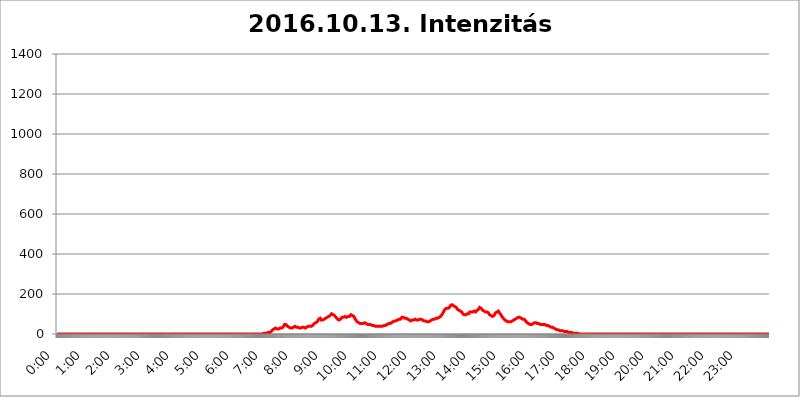
| Category | 2016.10.13. Intenzitás [W/m^2] |
|---|---|
| 0.0 | 0 |
| 0.0006944444444444445 | 0 |
| 0.001388888888888889 | 0 |
| 0.0020833333333333333 | 0 |
| 0.002777777777777778 | 0 |
| 0.003472222222222222 | 0 |
| 0.004166666666666667 | 0 |
| 0.004861111111111111 | 0 |
| 0.005555555555555556 | 0 |
| 0.0062499999999999995 | 0 |
| 0.006944444444444444 | 0 |
| 0.007638888888888889 | 0 |
| 0.008333333333333333 | 0 |
| 0.009027777777777779 | 0 |
| 0.009722222222222222 | 0 |
| 0.010416666666666666 | 0 |
| 0.011111111111111112 | 0 |
| 0.011805555555555555 | 0 |
| 0.012499999999999999 | 0 |
| 0.013194444444444444 | 0 |
| 0.013888888888888888 | 0 |
| 0.014583333333333332 | 0 |
| 0.015277777777777777 | 0 |
| 0.015972222222222224 | 0 |
| 0.016666666666666666 | 0 |
| 0.017361111111111112 | 0 |
| 0.018055555555555557 | 0 |
| 0.01875 | 0 |
| 0.019444444444444445 | 0 |
| 0.02013888888888889 | 0 |
| 0.020833333333333332 | 0 |
| 0.02152777777777778 | 0 |
| 0.022222222222222223 | 0 |
| 0.02291666666666667 | 0 |
| 0.02361111111111111 | 0 |
| 0.024305555555555556 | 0 |
| 0.024999999999999998 | 0 |
| 0.025694444444444447 | 0 |
| 0.02638888888888889 | 0 |
| 0.027083333333333334 | 0 |
| 0.027777777777777776 | 0 |
| 0.02847222222222222 | 0 |
| 0.029166666666666664 | 0 |
| 0.029861111111111113 | 0 |
| 0.030555555555555555 | 0 |
| 0.03125 | 0 |
| 0.03194444444444445 | 0 |
| 0.03263888888888889 | 0 |
| 0.03333333333333333 | 0 |
| 0.034027777777777775 | 0 |
| 0.034722222222222224 | 0 |
| 0.035416666666666666 | 0 |
| 0.036111111111111115 | 0 |
| 0.03680555555555556 | 0 |
| 0.0375 | 0 |
| 0.03819444444444444 | 0 |
| 0.03888888888888889 | 0 |
| 0.03958333333333333 | 0 |
| 0.04027777777777778 | 0 |
| 0.04097222222222222 | 0 |
| 0.041666666666666664 | 0 |
| 0.042361111111111106 | 0 |
| 0.04305555555555556 | 0 |
| 0.043750000000000004 | 0 |
| 0.044444444444444446 | 0 |
| 0.04513888888888889 | 0 |
| 0.04583333333333334 | 0 |
| 0.04652777777777778 | 0 |
| 0.04722222222222222 | 0 |
| 0.04791666666666666 | 0 |
| 0.04861111111111111 | 0 |
| 0.049305555555555554 | 0 |
| 0.049999999999999996 | 0 |
| 0.05069444444444445 | 0 |
| 0.051388888888888894 | 0 |
| 0.052083333333333336 | 0 |
| 0.05277777777777778 | 0 |
| 0.05347222222222222 | 0 |
| 0.05416666666666667 | 0 |
| 0.05486111111111111 | 0 |
| 0.05555555555555555 | 0 |
| 0.05625 | 0 |
| 0.05694444444444444 | 0 |
| 0.057638888888888885 | 0 |
| 0.05833333333333333 | 0 |
| 0.05902777777777778 | 0 |
| 0.059722222222222225 | 0 |
| 0.06041666666666667 | 0 |
| 0.061111111111111116 | 0 |
| 0.06180555555555556 | 0 |
| 0.0625 | 0 |
| 0.06319444444444444 | 0 |
| 0.06388888888888888 | 0 |
| 0.06458333333333334 | 0 |
| 0.06527777777777778 | 0 |
| 0.06597222222222222 | 0 |
| 0.06666666666666667 | 0 |
| 0.06736111111111111 | 0 |
| 0.06805555555555555 | 0 |
| 0.06874999999999999 | 0 |
| 0.06944444444444443 | 0 |
| 0.07013888888888889 | 0 |
| 0.07083333333333333 | 0 |
| 0.07152777777777779 | 0 |
| 0.07222222222222223 | 0 |
| 0.07291666666666667 | 0 |
| 0.07361111111111111 | 0 |
| 0.07430555555555556 | 0 |
| 0.075 | 0 |
| 0.07569444444444444 | 0 |
| 0.0763888888888889 | 0 |
| 0.07708333333333334 | 0 |
| 0.07777777777777778 | 0 |
| 0.07847222222222222 | 0 |
| 0.07916666666666666 | 0 |
| 0.0798611111111111 | 0 |
| 0.08055555555555556 | 0 |
| 0.08125 | 0 |
| 0.08194444444444444 | 0 |
| 0.08263888888888889 | 0 |
| 0.08333333333333333 | 0 |
| 0.08402777777777777 | 0 |
| 0.08472222222222221 | 0 |
| 0.08541666666666665 | 0 |
| 0.08611111111111112 | 0 |
| 0.08680555555555557 | 0 |
| 0.08750000000000001 | 0 |
| 0.08819444444444445 | 0 |
| 0.08888888888888889 | 0 |
| 0.08958333333333333 | 0 |
| 0.09027777777777778 | 0 |
| 0.09097222222222222 | 0 |
| 0.09166666666666667 | 0 |
| 0.09236111111111112 | 0 |
| 0.09305555555555556 | 0 |
| 0.09375 | 0 |
| 0.09444444444444444 | 0 |
| 0.09513888888888888 | 0 |
| 0.09583333333333333 | 0 |
| 0.09652777777777777 | 0 |
| 0.09722222222222222 | 0 |
| 0.09791666666666667 | 0 |
| 0.09861111111111111 | 0 |
| 0.09930555555555555 | 0 |
| 0.09999999999999999 | 0 |
| 0.10069444444444443 | 0 |
| 0.1013888888888889 | 0 |
| 0.10208333333333335 | 0 |
| 0.10277777777777779 | 0 |
| 0.10347222222222223 | 0 |
| 0.10416666666666667 | 0 |
| 0.10486111111111111 | 0 |
| 0.10555555555555556 | 0 |
| 0.10625 | 0 |
| 0.10694444444444444 | 0 |
| 0.1076388888888889 | 0 |
| 0.10833333333333334 | 0 |
| 0.10902777777777778 | 0 |
| 0.10972222222222222 | 0 |
| 0.1111111111111111 | 0 |
| 0.11180555555555556 | 0 |
| 0.11180555555555556 | 0 |
| 0.1125 | 0 |
| 0.11319444444444444 | 0 |
| 0.11388888888888889 | 0 |
| 0.11458333333333333 | 0 |
| 0.11527777777777777 | 0 |
| 0.11597222222222221 | 0 |
| 0.11666666666666665 | 0 |
| 0.1173611111111111 | 0 |
| 0.11805555555555557 | 0 |
| 0.11944444444444445 | 0 |
| 0.12013888888888889 | 0 |
| 0.12083333333333333 | 0 |
| 0.12152777777777778 | 0 |
| 0.12222222222222223 | 0 |
| 0.12291666666666667 | 0 |
| 0.12291666666666667 | 0 |
| 0.12361111111111112 | 0 |
| 0.12430555555555556 | 0 |
| 0.125 | 0 |
| 0.12569444444444444 | 0 |
| 0.12638888888888888 | 0 |
| 0.12708333333333333 | 0 |
| 0.16875 | 0 |
| 0.12847222222222224 | 0 |
| 0.12916666666666668 | 0 |
| 0.12986111111111112 | 0 |
| 0.13055555555555556 | 0 |
| 0.13125 | 0 |
| 0.13194444444444445 | 0 |
| 0.1326388888888889 | 0 |
| 0.13333333333333333 | 0 |
| 0.13402777777777777 | 0 |
| 0.13402777777777777 | 0 |
| 0.13472222222222222 | 0 |
| 0.13541666666666666 | 0 |
| 0.1361111111111111 | 0 |
| 0.13749999999999998 | 0 |
| 0.13819444444444443 | 0 |
| 0.1388888888888889 | 0 |
| 0.13958333333333334 | 0 |
| 0.14027777777777778 | 0 |
| 0.14097222222222222 | 0 |
| 0.14166666666666666 | 0 |
| 0.1423611111111111 | 0 |
| 0.14305555555555557 | 0 |
| 0.14375000000000002 | 0 |
| 0.14444444444444446 | 0 |
| 0.1451388888888889 | 0 |
| 0.1451388888888889 | 0 |
| 0.14652777777777778 | 0 |
| 0.14722222222222223 | 0 |
| 0.14791666666666667 | 0 |
| 0.1486111111111111 | 0 |
| 0.14930555555555555 | 0 |
| 0.15 | 0 |
| 0.15069444444444444 | 0 |
| 0.15138888888888888 | 0 |
| 0.15208333333333332 | 0 |
| 0.15277777777777776 | 0 |
| 0.15347222222222223 | 0 |
| 0.15416666666666667 | 0 |
| 0.15486111111111112 | 0 |
| 0.15555555555555556 | 0 |
| 0.15625 | 0 |
| 0.15694444444444444 | 0 |
| 0.15763888888888888 | 0 |
| 0.15833333333333333 | 0 |
| 0.15902777777777777 | 0 |
| 0.15972222222222224 | 0 |
| 0.16041666666666668 | 0 |
| 0.16111111111111112 | 0 |
| 0.16180555555555556 | 0 |
| 0.1625 | 0 |
| 0.16319444444444445 | 0 |
| 0.1638888888888889 | 0 |
| 0.16458333333333333 | 0 |
| 0.16527777777777777 | 0 |
| 0.16597222222222222 | 0 |
| 0.16666666666666666 | 0 |
| 0.1673611111111111 | 0 |
| 0.16805555555555554 | 0 |
| 0.16874999999999998 | 0 |
| 0.16944444444444443 | 0 |
| 0.17013888888888887 | 0 |
| 0.1708333333333333 | 0 |
| 0.17152777777777775 | 0 |
| 0.17222222222222225 | 0 |
| 0.1729166666666667 | 0 |
| 0.17361111111111113 | 0 |
| 0.17430555555555557 | 0 |
| 0.17500000000000002 | 0 |
| 0.17569444444444446 | 0 |
| 0.1763888888888889 | 0 |
| 0.17708333333333334 | 0 |
| 0.17777777777777778 | 0 |
| 0.17847222222222223 | 0 |
| 0.17916666666666667 | 0 |
| 0.1798611111111111 | 0 |
| 0.18055555555555555 | 0 |
| 0.18125 | 0 |
| 0.18194444444444444 | 0 |
| 0.1826388888888889 | 0 |
| 0.18333333333333335 | 0 |
| 0.1840277777777778 | 0 |
| 0.18472222222222223 | 0 |
| 0.18541666666666667 | 0 |
| 0.18611111111111112 | 0 |
| 0.18680555555555556 | 0 |
| 0.1875 | 0 |
| 0.18819444444444444 | 0 |
| 0.18888888888888888 | 0 |
| 0.18958333333333333 | 0 |
| 0.19027777777777777 | 0 |
| 0.1909722222222222 | 0 |
| 0.19166666666666665 | 0 |
| 0.19236111111111112 | 0 |
| 0.19305555555555554 | 0 |
| 0.19375 | 0 |
| 0.19444444444444445 | 0 |
| 0.1951388888888889 | 0 |
| 0.19583333333333333 | 0 |
| 0.19652777777777777 | 0 |
| 0.19722222222222222 | 0 |
| 0.19791666666666666 | 0 |
| 0.1986111111111111 | 0 |
| 0.19930555555555554 | 0 |
| 0.19999999999999998 | 0 |
| 0.20069444444444443 | 0 |
| 0.20138888888888887 | 0 |
| 0.2020833333333333 | 0 |
| 0.2027777777777778 | 0 |
| 0.2034722222222222 | 0 |
| 0.2041666666666667 | 0 |
| 0.20486111111111113 | 0 |
| 0.20555555555555557 | 0 |
| 0.20625000000000002 | 0 |
| 0.20694444444444446 | 0 |
| 0.2076388888888889 | 0 |
| 0.20833333333333334 | 0 |
| 0.20902777777777778 | 0 |
| 0.20972222222222223 | 0 |
| 0.21041666666666667 | 0 |
| 0.2111111111111111 | 0 |
| 0.21180555555555555 | 0 |
| 0.2125 | 0 |
| 0.21319444444444444 | 0 |
| 0.2138888888888889 | 0 |
| 0.21458333333333335 | 0 |
| 0.2152777777777778 | 0 |
| 0.21597222222222223 | 0 |
| 0.21666666666666667 | 0 |
| 0.21736111111111112 | 0 |
| 0.21805555555555556 | 0 |
| 0.21875 | 0 |
| 0.21944444444444444 | 0 |
| 0.22013888888888888 | 0 |
| 0.22083333333333333 | 0 |
| 0.22152777777777777 | 0 |
| 0.2222222222222222 | 0 |
| 0.22291666666666665 | 0 |
| 0.2236111111111111 | 0 |
| 0.22430555555555556 | 0 |
| 0.225 | 0 |
| 0.22569444444444445 | 0 |
| 0.2263888888888889 | 0 |
| 0.22708333333333333 | 0 |
| 0.22777777777777777 | 0 |
| 0.22847222222222222 | 0 |
| 0.22916666666666666 | 0 |
| 0.2298611111111111 | 0 |
| 0.23055555555555554 | 0 |
| 0.23124999999999998 | 0 |
| 0.23194444444444443 | 0 |
| 0.23263888888888887 | 0 |
| 0.2333333333333333 | 0 |
| 0.2340277777777778 | 0 |
| 0.2347222222222222 | 0 |
| 0.2354166666666667 | 0 |
| 0.23611111111111113 | 0 |
| 0.23680555555555557 | 0 |
| 0.23750000000000002 | 0 |
| 0.23819444444444446 | 0 |
| 0.2388888888888889 | 0 |
| 0.23958333333333334 | 0 |
| 0.24027777777777778 | 0 |
| 0.24097222222222223 | 0 |
| 0.24166666666666667 | 0 |
| 0.2423611111111111 | 0 |
| 0.24305555555555555 | 0 |
| 0.24375 | 0 |
| 0.24444444444444446 | 0 |
| 0.24513888888888888 | 0 |
| 0.24583333333333335 | 0 |
| 0.2465277777777778 | 0 |
| 0.24722222222222223 | 0 |
| 0.24791666666666667 | 0 |
| 0.24861111111111112 | 0 |
| 0.24930555555555556 | 0 |
| 0.25 | 0 |
| 0.25069444444444444 | 0 |
| 0.2513888888888889 | 0 |
| 0.2520833333333333 | 0 |
| 0.25277777777777777 | 0 |
| 0.2534722222222222 | 0 |
| 0.25416666666666665 | 0 |
| 0.2548611111111111 | 0 |
| 0.2555555555555556 | 0 |
| 0.25625000000000003 | 0 |
| 0.2569444444444445 | 0 |
| 0.2576388888888889 | 0 |
| 0.25833333333333336 | 0 |
| 0.2590277777777778 | 0 |
| 0.25972222222222224 | 0 |
| 0.2604166666666667 | 0 |
| 0.2611111111111111 | 0 |
| 0.26180555555555557 | 0 |
| 0.2625 | 0 |
| 0.26319444444444445 | 0 |
| 0.2638888888888889 | 0 |
| 0.26458333333333334 | 0 |
| 0.2652777777777778 | 0 |
| 0.2659722222222222 | 0 |
| 0.26666666666666666 | 0 |
| 0.2673611111111111 | 0 |
| 0.26805555555555555 | 0 |
| 0.26875 | 0 |
| 0.26944444444444443 | 0 |
| 0.2701388888888889 | 0 |
| 0.2708333333333333 | 0 |
| 0.27152777777777776 | 0 |
| 0.2722222222222222 | 0 |
| 0.27291666666666664 | 0 |
| 0.2736111111111111 | 0 |
| 0.2743055555555555 | 0 |
| 0.27499999999999997 | 0 |
| 0.27569444444444446 | 0 |
| 0.27638888888888885 | 0 |
| 0.27708333333333335 | 0 |
| 0.2777777777777778 | 0 |
| 0.27847222222222223 | 0 |
| 0.2791666666666667 | 0 |
| 0.2798611111111111 | 0 |
| 0.28055555555555556 | 0 |
| 0.28125 | 0 |
| 0.28194444444444444 | 0 |
| 0.2826388888888889 | 0 |
| 0.2833333333333333 | 0 |
| 0.28402777777777777 | 0 |
| 0.2847222222222222 | 0 |
| 0.28541666666666665 | 0 |
| 0.28611111111111115 | 0 |
| 0.28680555555555554 | 0 |
| 0.28750000000000003 | 0 |
| 0.2881944444444445 | 3.525 |
| 0.2888888888888889 | 3.525 |
| 0.28958333333333336 | 3.525 |
| 0.2902777777777778 | 3.525 |
| 0.29097222222222224 | 3.525 |
| 0.2916666666666667 | 3.525 |
| 0.2923611111111111 | 3.525 |
| 0.29305555555555557 | 3.525 |
| 0.29375 | 3.525 |
| 0.29444444444444445 | 7.887 |
| 0.2951388888888889 | 7.887 |
| 0.29583333333333334 | 7.887 |
| 0.2965277777777778 | 7.887 |
| 0.2972222222222222 | 7.887 |
| 0.29791666666666666 | 7.887 |
| 0.2986111111111111 | 12.257 |
| 0.29930555555555555 | 12.257 |
| 0.3 | 12.257 |
| 0.30069444444444443 | 12.257 |
| 0.3013888888888889 | 16.636 |
| 0.3020833333333333 | 21.024 |
| 0.30277777777777776 | 21.024 |
| 0.3034722222222222 | 25.419 |
| 0.30416666666666664 | 25.419 |
| 0.3048611111111111 | 25.419 |
| 0.3055555555555555 | 29.823 |
| 0.30624999999999997 | 29.823 |
| 0.3069444444444444 | 29.823 |
| 0.3076388888888889 | 29.823 |
| 0.30833333333333335 | 25.419 |
| 0.3090277777777778 | 25.419 |
| 0.30972222222222223 | 25.419 |
| 0.3104166666666667 | 25.419 |
| 0.3111111111111111 | 29.823 |
| 0.31180555555555556 | 29.823 |
| 0.3125 | 29.823 |
| 0.31319444444444444 | 29.823 |
| 0.3138888888888889 | 29.823 |
| 0.3145833333333333 | 29.823 |
| 0.31527777777777777 | 29.823 |
| 0.3159722222222222 | 29.823 |
| 0.31666666666666665 | 34.234 |
| 0.31736111111111115 | 34.234 |
| 0.31805555555555554 | 38.653 |
| 0.31875000000000003 | 47.511 |
| 0.3194444444444445 | 51.951 |
| 0.3201388888888889 | 51.951 |
| 0.32083333333333336 | 47.511 |
| 0.3215277777777778 | 43.079 |
| 0.32222222222222224 | 43.079 |
| 0.3229166666666667 | 38.653 |
| 0.3236111111111111 | 38.653 |
| 0.32430555555555557 | 34.234 |
| 0.325 | 34.234 |
| 0.32569444444444445 | 34.234 |
| 0.3263888888888889 | 34.234 |
| 0.32708333333333334 | 29.823 |
| 0.3277777777777778 | 29.823 |
| 0.3284722222222222 | 29.823 |
| 0.32916666666666666 | 29.823 |
| 0.3298611111111111 | 29.823 |
| 0.33055555555555555 | 29.823 |
| 0.33125 | 34.234 |
| 0.33194444444444443 | 34.234 |
| 0.3326388888888889 | 38.653 |
| 0.3333333333333333 | 38.653 |
| 0.3340277777777778 | 34.234 |
| 0.3347222222222222 | 34.234 |
| 0.3354166666666667 | 34.234 |
| 0.3361111111111111 | 34.234 |
| 0.3368055555555556 | 34.234 |
| 0.33749999999999997 | 34.234 |
| 0.33819444444444446 | 34.234 |
| 0.33888888888888885 | 29.823 |
| 0.33958333333333335 | 29.823 |
| 0.34027777777777773 | 29.823 |
| 0.34097222222222223 | 29.823 |
| 0.3416666666666666 | 29.823 |
| 0.3423611111111111 | 34.234 |
| 0.3430555555555555 | 34.234 |
| 0.34375 | 34.234 |
| 0.3444444444444445 | 34.234 |
| 0.3451388888888889 | 34.234 |
| 0.3458333333333334 | 34.234 |
| 0.34652777777777777 | 34.234 |
| 0.34722222222222227 | 29.823 |
| 0.34791666666666665 | 29.823 |
| 0.34861111111111115 | 29.823 |
| 0.34930555555555554 | 29.823 |
| 0.35000000000000003 | 34.234 |
| 0.3506944444444444 | 34.234 |
| 0.3513888888888889 | 34.234 |
| 0.3520833333333333 | 38.653 |
| 0.3527777777777778 | 38.653 |
| 0.3534722222222222 | 34.234 |
| 0.3541666666666667 | 38.653 |
| 0.3548611111111111 | 38.653 |
| 0.35555555555555557 | 34.234 |
| 0.35625 | 38.653 |
| 0.35694444444444445 | 38.653 |
| 0.3576388888888889 | 38.653 |
| 0.35833333333333334 | 43.079 |
| 0.3590277777777778 | 47.511 |
| 0.3597222222222222 | 47.511 |
| 0.36041666666666666 | 51.951 |
| 0.3611111111111111 | 51.951 |
| 0.36180555555555555 | 51.951 |
| 0.3625 | 56.398 |
| 0.36319444444444443 | 56.398 |
| 0.3638888888888889 | 60.85 |
| 0.3645833333333333 | 60.85 |
| 0.3652777777777778 | 65.31 |
| 0.3659722222222222 | 65.31 |
| 0.3666666666666667 | 74.246 |
| 0.3673611111111111 | 78.722 |
| 0.3680555555555556 | 78.722 |
| 0.36874999999999997 | 78.722 |
| 0.36944444444444446 | 74.246 |
| 0.37013888888888885 | 69.775 |
| 0.37083333333333335 | 69.775 |
| 0.37152777777777773 | 69.775 |
| 0.37222222222222223 | 69.775 |
| 0.3729166666666666 | 69.775 |
| 0.3736111111111111 | 74.246 |
| 0.3743055555555555 | 74.246 |
| 0.375 | 78.722 |
| 0.3756944444444445 | 78.722 |
| 0.3763888888888889 | 78.722 |
| 0.3770833333333334 | 78.722 |
| 0.37777777777777777 | 78.722 |
| 0.37847222222222227 | 83.205 |
| 0.37916666666666665 | 83.205 |
| 0.37986111111111115 | 83.205 |
| 0.38055555555555554 | 87.692 |
| 0.38125000000000003 | 92.184 |
| 0.3819444444444444 | 92.184 |
| 0.3826388888888889 | 92.184 |
| 0.3833333333333333 | 92.184 |
| 0.3840277777777778 | 96.682 |
| 0.3847222222222222 | 101.184 |
| 0.3854166666666667 | 105.69 |
| 0.3861111111111111 | 101.184 |
| 0.38680555555555557 | 96.682 |
| 0.3875 | 92.184 |
| 0.38819444444444445 | 92.184 |
| 0.3888888888888889 | 92.184 |
| 0.38958333333333334 | 92.184 |
| 0.3902777777777778 | 87.692 |
| 0.3909722222222222 | 83.205 |
| 0.39166666666666666 | 83.205 |
| 0.3923611111111111 | 78.722 |
| 0.39305555555555555 | 74.246 |
| 0.39375 | 74.246 |
| 0.39444444444444443 | 69.775 |
| 0.3951388888888889 | 69.775 |
| 0.3958333333333333 | 69.775 |
| 0.3965277777777778 | 74.246 |
| 0.3972222222222222 | 74.246 |
| 0.3979166666666667 | 78.722 |
| 0.3986111111111111 | 78.722 |
| 0.3993055555555556 | 83.205 |
| 0.39999999999999997 | 83.205 |
| 0.40069444444444446 | 83.205 |
| 0.40138888888888885 | 83.205 |
| 0.40208333333333335 | 83.205 |
| 0.40277777777777773 | 87.692 |
| 0.40347222222222223 | 87.692 |
| 0.4041666666666666 | 87.692 |
| 0.4048611111111111 | 83.205 |
| 0.4055555555555555 | 83.205 |
| 0.40625 | 83.205 |
| 0.4069444444444445 | 83.205 |
| 0.4076388888888889 | 87.692 |
| 0.4083333333333334 | 87.692 |
| 0.40902777777777777 | 87.692 |
| 0.40972222222222227 | 87.692 |
| 0.41041666666666665 | 92.184 |
| 0.41111111111111115 | 92.184 |
| 0.41180555555555554 | 96.682 |
| 0.41250000000000003 | 96.682 |
| 0.4131944444444444 | 96.682 |
| 0.4138888888888889 | 92.184 |
| 0.4145833333333333 | 92.184 |
| 0.4152777777777778 | 92.184 |
| 0.4159722222222222 | 87.692 |
| 0.4166666666666667 | 83.205 |
| 0.4173611111111111 | 78.722 |
| 0.41805555555555557 | 74.246 |
| 0.41875 | 69.775 |
| 0.41944444444444445 | 65.31 |
| 0.4201388888888889 | 65.31 |
| 0.42083333333333334 | 60.85 |
| 0.4215277777777778 | 60.85 |
| 0.4222222222222222 | 56.398 |
| 0.42291666666666666 | 56.398 |
| 0.4236111111111111 | 56.398 |
| 0.42430555555555555 | 51.951 |
| 0.425 | 51.951 |
| 0.42569444444444443 | 51.951 |
| 0.4263888888888889 | 51.951 |
| 0.4270833333333333 | 51.951 |
| 0.4277777777777778 | 51.951 |
| 0.4284722222222222 | 51.951 |
| 0.4291666666666667 | 51.951 |
| 0.4298611111111111 | 51.951 |
| 0.4305555555555556 | 56.398 |
| 0.43124999999999997 | 56.398 |
| 0.43194444444444446 | 56.398 |
| 0.43263888888888885 | 51.951 |
| 0.43333333333333335 | 51.951 |
| 0.43402777777777773 | 51.951 |
| 0.43472222222222223 | 51.951 |
| 0.4354166666666666 | 47.511 |
| 0.4361111111111111 | 47.511 |
| 0.4368055555555555 | 47.511 |
| 0.4375 | 47.511 |
| 0.4381944444444445 | 47.511 |
| 0.4388888888888889 | 47.511 |
| 0.4395833333333334 | 47.511 |
| 0.44027777777777777 | 47.511 |
| 0.44097222222222227 | 43.079 |
| 0.44166666666666665 | 43.079 |
| 0.44236111111111115 | 43.079 |
| 0.44305555555555554 | 43.079 |
| 0.44375000000000003 | 43.079 |
| 0.4444444444444444 | 43.079 |
| 0.4451388888888889 | 43.079 |
| 0.4458333333333333 | 38.653 |
| 0.4465277777777778 | 38.653 |
| 0.4472222222222222 | 38.653 |
| 0.4479166666666667 | 38.653 |
| 0.4486111111111111 | 38.653 |
| 0.44930555555555557 | 38.653 |
| 0.45 | 38.653 |
| 0.45069444444444445 | 38.653 |
| 0.4513888888888889 | 38.653 |
| 0.45208333333333334 | 38.653 |
| 0.4527777777777778 | 38.653 |
| 0.4534722222222222 | 38.653 |
| 0.45416666666666666 | 38.653 |
| 0.4548611111111111 | 38.653 |
| 0.45555555555555555 | 38.653 |
| 0.45625 | 38.653 |
| 0.45694444444444443 | 38.653 |
| 0.4576388888888889 | 38.653 |
| 0.4583333333333333 | 43.079 |
| 0.4590277777777778 | 43.079 |
| 0.4597222222222222 | 43.079 |
| 0.4604166666666667 | 43.079 |
| 0.4611111111111111 | 43.079 |
| 0.4618055555555556 | 47.511 |
| 0.46249999999999997 | 47.511 |
| 0.46319444444444446 | 47.511 |
| 0.46388888888888885 | 47.511 |
| 0.46458333333333335 | 51.951 |
| 0.46527777777777773 | 56.398 |
| 0.46597222222222223 | 56.398 |
| 0.4666666666666666 | 51.951 |
| 0.4673611111111111 | 56.398 |
| 0.4680555555555555 | 56.398 |
| 0.46875 | 56.398 |
| 0.4694444444444445 | 60.85 |
| 0.4701388888888889 | 60.85 |
| 0.4708333333333334 | 60.85 |
| 0.47152777777777777 | 60.85 |
| 0.47222222222222227 | 60.85 |
| 0.47291666666666665 | 65.31 |
| 0.47361111111111115 | 65.31 |
| 0.47430555555555554 | 65.31 |
| 0.47500000000000003 | 65.31 |
| 0.4756944444444444 | 65.31 |
| 0.4763888888888889 | 65.31 |
| 0.4770833333333333 | 69.775 |
| 0.4777777777777778 | 69.775 |
| 0.4784722222222222 | 69.775 |
| 0.4791666666666667 | 74.246 |
| 0.4798611111111111 | 74.246 |
| 0.48055555555555557 | 74.246 |
| 0.48125 | 74.246 |
| 0.48194444444444445 | 78.722 |
| 0.4826388888888889 | 78.722 |
| 0.48333333333333334 | 83.205 |
| 0.4840277777777778 | 83.205 |
| 0.4847222222222222 | 83.205 |
| 0.48541666666666666 | 83.205 |
| 0.4861111111111111 | 83.205 |
| 0.48680555555555555 | 83.205 |
| 0.4875 | 78.722 |
| 0.48819444444444443 | 78.722 |
| 0.4888888888888889 | 78.722 |
| 0.4895833333333333 | 78.722 |
| 0.4902777777777778 | 78.722 |
| 0.4909722222222222 | 74.246 |
| 0.4916666666666667 | 74.246 |
| 0.4923611111111111 | 69.775 |
| 0.4930555555555556 | 69.775 |
| 0.49374999999999997 | 69.775 |
| 0.49444444444444446 | 65.31 |
| 0.49513888888888885 | 65.31 |
| 0.49583333333333335 | 65.31 |
| 0.49652777777777773 | 65.31 |
| 0.49722222222222223 | 69.775 |
| 0.4979166666666666 | 69.775 |
| 0.4986111111111111 | 69.775 |
| 0.4993055555555555 | 69.775 |
| 0.5 | 69.775 |
| 0.5006944444444444 | 69.775 |
| 0.5013888888888889 | 69.775 |
| 0.5020833333333333 | 74.246 |
| 0.5027777777777778 | 74.246 |
| 0.5034722222222222 | 74.246 |
| 0.5041666666666667 | 69.775 |
| 0.5048611111111111 | 69.775 |
| 0.5055555555555555 | 69.775 |
| 0.50625 | 69.775 |
| 0.5069444444444444 | 69.775 |
| 0.5076388888888889 | 69.775 |
| 0.5083333333333333 | 74.246 |
| 0.5090277777777777 | 74.246 |
| 0.5097222222222222 | 74.246 |
| 0.5104166666666666 | 74.246 |
| 0.5111111111111112 | 74.246 |
| 0.5118055555555555 | 69.775 |
| 0.5125000000000001 | 69.775 |
| 0.5131944444444444 | 65.31 |
| 0.513888888888889 | 65.31 |
| 0.5145833333333333 | 65.31 |
| 0.5152777777777778 | 65.31 |
| 0.5159722222222222 | 65.31 |
| 0.5166666666666667 | 65.31 |
| 0.517361111111111 | 65.31 |
| 0.5180555555555556 | 60.85 |
| 0.5187499999999999 | 60.85 |
| 0.5194444444444445 | 60.85 |
| 0.5201388888888888 | 60.85 |
| 0.5208333333333334 | 60.85 |
| 0.5215277777777778 | 60.85 |
| 0.5222222222222223 | 65.31 |
| 0.5229166666666667 | 65.31 |
| 0.5236111111111111 | 65.31 |
| 0.5243055555555556 | 69.775 |
| 0.525 | 69.775 |
| 0.5256944444444445 | 69.775 |
| 0.5263888888888889 | 69.775 |
| 0.5270833333333333 | 74.246 |
| 0.5277777777777778 | 74.246 |
| 0.5284722222222222 | 74.246 |
| 0.5291666666666667 | 74.246 |
| 0.5298611111111111 | 78.722 |
| 0.5305555555555556 | 78.722 |
| 0.53125 | 78.722 |
| 0.5319444444444444 | 78.722 |
| 0.5326388888888889 | 78.722 |
| 0.5333333333333333 | 78.722 |
| 0.5340277777777778 | 83.205 |
| 0.5347222222222222 | 83.205 |
| 0.5354166666666667 | 83.205 |
| 0.5361111111111111 | 83.205 |
| 0.5368055555555555 | 83.205 |
| 0.5375 | 87.692 |
| 0.5381944444444444 | 87.692 |
| 0.5388888888888889 | 92.184 |
| 0.5395833333333333 | 96.682 |
| 0.5402777777777777 | 101.184 |
| 0.5409722222222222 | 105.69 |
| 0.5416666666666666 | 110.201 |
| 0.5423611111111112 | 114.716 |
| 0.5430555555555555 | 119.235 |
| 0.5437500000000001 | 123.758 |
| 0.5444444444444444 | 123.758 |
| 0.545138888888889 | 128.284 |
| 0.5458333333333333 | 128.284 |
| 0.5465277777777778 | 128.284 |
| 0.5472222222222222 | 128.284 |
| 0.5479166666666667 | 128.284 |
| 0.548611111111111 | 128.284 |
| 0.5493055555555556 | 132.814 |
| 0.5499999999999999 | 132.814 |
| 0.5506944444444445 | 137.347 |
| 0.5513888888888888 | 141.884 |
| 0.5520833333333334 | 146.423 |
| 0.5527777777777778 | 146.423 |
| 0.5534722222222223 | 146.423 |
| 0.5541666666666667 | 146.423 |
| 0.5548611111111111 | 141.884 |
| 0.5555555555555556 | 141.884 |
| 0.55625 | 137.347 |
| 0.5569444444444445 | 137.347 |
| 0.5576388888888889 | 137.347 |
| 0.5583333333333333 | 132.814 |
| 0.5590277777777778 | 132.814 |
| 0.5597222222222222 | 132.814 |
| 0.5604166666666667 | 128.284 |
| 0.5611111111111111 | 123.758 |
| 0.5618055555555556 | 119.235 |
| 0.5625 | 119.235 |
| 0.5631944444444444 | 119.235 |
| 0.5638888888888889 | 119.235 |
| 0.5645833333333333 | 114.716 |
| 0.5652777777777778 | 114.716 |
| 0.5659722222222222 | 114.716 |
| 0.5666666666666667 | 110.201 |
| 0.5673611111111111 | 110.201 |
| 0.5680555555555555 | 105.69 |
| 0.56875 | 101.184 |
| 0.5694444444444444 | 101.184 |
| 0.5701388888888889 | 96.682 |
| 0.5708333333333333 | 96.682 |
| 0.5715277777777777 | 96.682 |
| 0.5722222222222222 | 96.682 |
| 0.5729166666666666 | 96.682 |
| 0.5736111111111112 | 96.682 |
| 0.5743055555555555 | 101.184 |
| 0.5750000000000001 | 101.184 |
| 0.5756944444444444 | 101.184 |
| 0.576388888888889 | 101.184 |
| 0.5770833333333333 | 101.184 |
| 0.5777777777777778 | 105.69 |
| 0.5784722222222222 | 110.201 |
| 0.5791666666666667 | 110.201 |
| 0.579861111111111 | 110.201 |
| 0.5805555555555556 | 110.201 |
| 0.5812499999999999 | 110.201 |
| 0.5819444444444445 | 110.201 |
| 0.5826388888888888 | 110.201 |
| 0.5833333333333334 | 114.716 |
| 0.5840277777777778 | 114.716 |
| 0.5847222222222223 | 114.716 |
| 0.5854166666666667 | 110.201 |
| 0.5861111111111111 | 110.201 |
| 0.5868055555555556 | 110.201 |
| 0.5875 | 110.201 |
| 0.5881944444444445 | 114.716 |
| 0.5888888888888889 | 119.235 |
| 0.5895833333333333 | 119.235 |
| 0.5902777777777778 | 123.758 |
| 0.5909722222222222 | 123.758 |
| 0.5916666666666667 | 128.284 |
| 0.5923611111111111 | 132.814 |
| 0.5930555555555556 | 132.814 |
| 0.59375 | 132.814 |
| 0.5944444444444444 | 128.284 |
| 0.5951388888888889 | 128.284 |
| 0.5958333333333333 | 123.758 |
| 0.5965277777777778 | 119.235 |
| 0.5972222222222222 | 119.235 |
| 0.5979166666666667 | 114.716 |
| 0.5986111111111111 | 114.716 |
| 0.5993055555555555 | 110.201 |
| 0.6 | 110.201 |
| 0.6006944444444444 | 110.201 |
| 0.6013888888888889 | 110.201 |
| 0.6020833333333333 | 110.201 |
| 0.6027777777777777 | 110.201 |
| 0.6034722222222222 | 110.201 |
| 0.6041666666666666 | 105.69 |
| 0.6048611111111112 | 105.69 |
| 0.6055555555555555 | 101.184 |
| 0.6062500000000001 | 96.682 |
| 0.6069444444444444 | 96.682 |
| 0.607638888888889 | 92.184 |
| 0.6083333333333333 | 92.184 |
| 0.6090277777777778 | 87.692 |
| 0.6097222222222222 | 87.692 |
| 0.6104166666666667 | 87.692 |
| 0.611111111111111 | 87.692 |
| 0.6118055555555556 | 87.692 |
| 0.6124999999999999 | 92.184 |
| 0.6131944444444445 | 96.682 |
| 0.6138888888888888 | 96.682 |
| 0.6145833333333334 | 105.69 |
| 0.6152777777777778 | 105.69 |
| 0.6159722222222223 | 110.201 |
| 0.6166666666666667 | 110.201 |
| 0.6173611111111111 | 110.201 |
| 0.6180555555555556 | 114.716 |
| 0.61875 | 114.716 |
| 0.6194444444444445 | 110.201 |
| 0.6201388888888889 | 105.69 |
| 0.6208333333333333 | 101.184 |
| 0.6215277777777778 | 101.184 |
| 0.6222222222222222 | 96.682 |
| 0.6229166666666667 | 92.184 |
| 0.6236111111111111 | 87.692 |
| 0.6243055555555556 | 83.205 |
| 0.625 | 83.205 |
| 0.6256944444444444 | 78.722 |
| 0.6263888888888889 | 78.722 |
| 0.6270833333333333 | 74.246 |
| 0.6277777777777778 | 69.775 |
| 0.6284722222222222 | 69.775 |
| 0.6291666666666667 | 65.31 |
| 0.6298611111111111 | 65.31 |
| 0.6305555555555555 | 65.31 |
| 0.63125 | 60.85 |
| 0.6319444444444444 | 60.85 |
| 0.6326388888888889 | 60.85 |
| 0.6333333333333333 | 60.85 |
| 0.6340277777777777 | 60.85 |
| 0.6347222222222222 | 60.85 |
| 0.6354166666666666 | 60.85 |
| 0.6361111111111112 | 60.85 |
| 0.6368055555555555 | 60.85 |
| 0.6375000000000001 | 65.31 |
| 0.6381944444444444 | 65.31 |
| 0.638888888888889 | 65.31 |
| 0.6395833333333333 | 65.31 |
| 0.6402777777777778 | 69.775 |
| 0.6409722222222222 | 69.775 |
| 0.6416666666666667 | 74.246 |
| 0.642361111111111 | 74.246 |
| 0.6430555555555556 | 74.246 |
| 0.6437499999999999 | 78.722 |
| 0.6444444444444445 | 78.722 |
| 0.6451388888888888 | 78.722 |
| 0.6458333333333334 | 78.722 |
| 0.6465277777777778 | 83.205 |
| 0.6472222222222223 | 83.205 |
| 0.6479166666666667 | 83.205 |
| 0.6486111111111111 | 83.205 |
| 0.6493055555555556 | 83.205 |
| 0.65 | 83.205 |
| 0.6506944444444445 | 78.722 |
| 0.6513888888888889 | 78.722 |
| 0.6520833333333333 | 78.722 |
| 0.6527777777777778 | 74.246 |
| 0.6534722222222222 | 74.246 |
| 0.6541666666666667 | 74.246 |
| 0.6548611111111111 | 74.246 |
| 0.6555555555555556 | 69.775 |
| 0.65625 | 69.775 |
| 0.6569444444444444 | 65.31 |
| 0.6576388888888889 | 65.31 |
| 0.6583333333333333 | 60.85 |
| 0.6590277777777778 | 56.398 |
| 0.6597222222222222 | 56.398 |
| 0.6604166666666667 | 51.951 |
| 0.6611111111111111 | 51.951 |
| 0.6618055555555555 | 51.951 |
| 0.6625 | 47.511 |
| 0.6631944444444444 | 47.511 |
| 0.6638888888888889 | 47.511 |
| 0.6645833333333333 | 47.511 |
| 0.6652777777777777 | 47.511 |
| 0.6659722222222222 | 47.511 |
| 0.6666666666666666 | 51.951 |
| 0.6673611111111111 | 51.951 |
| 0.6680555555555556 | 56.398 |
| 0.6687500000000001 | 56.398 |
| 0.6694444444444444 | 56.398 |
| 0.6701388888888888 | 56.398 |
| 0.6708333333333334 | 56.398 |
| 0.6715277777777778 | 56.398 |
| 0.6722222222222222 | 51.951 |
| 0.6729166666666666 | 51.951 |
| 0.6736111111111112 | 51.951 |
| 0.6743055555555556 | 51.951 |
| 0.6749999999999999 | 51.951 |
| 0.6756944444444444 | 51.951 |
| 0.6763888888888889 | 47.511 |
| 0.6770833333333334 | 47.511 |
| 0.6777777777777777 | 47.511 |
| 0.6784722222222223 | 47.511 |
| 0.6791666666666667 | 47.511 |
| 0.6798611111111111 | 47.511 |
| 0.6805555555555555 | 47.511 |
| 0.68125 | 47.511 |
| 0.6819444444444445 | 47.511 |
| 0.6826388888888889 | 47.511 |
| 0.6833333333333332 | 47.511 |
| 0.6840277777777778 | 47.511 |
| 0.6847222222222222 | 47.511 |
| 0.6854166666666667 | 43.079 |
| 0.686111111111111 | 43.079 |
| 0.6868055555555556 | 43.079 |
| 0.6875 | 43.079 |
| 0.6881944444444444 | 43.079 |
| 0.688888888888889 | 38.653 |
| 0.6895833333333333 | 38.653 |
| 0.6902777777777778 | 38.653 |
| 0.6909722222222222 | 38.653 |
| 0.6916666666666668 | 38.653 |
| 0.6923611111111111 | 34.234 |
| 0.6930555555555555 | 34.234 |
| 0.69375 | 34.234 |
| 0.6944444444444445 | 34.234 |
| 0.6951388888888889 | 34.234 |
| 0.6958333333333333 | 34.234 |
| 0.6965277777777777 | 29.823 |
| 0.6972222222222223 | 29.823 |
| 0.6979166666666666 | 29.823 |
| 0.6986111111111111 | 25.419 |
| 0.6993055555555556 | 25.419 |
| 0.7000000000000001 | 21.024 |
| 0.7006944444444444 | 21.024 |
| 0.7013888888888888 | 21.024 |
| 0.7020833333333334 | 21.024 |
| 0.7027777777777778 | 21.024 |
| 0.7034722222222222 | 21.024 |
| 0.7041666666666666 | 16.636 |
| 0.7048611111111112 | 16.636 |
| 0.7055555555555556 | 16.636 |
| 0.7062499999999999 | 16.636 |
| 0.7069444444444444 | 16.636 |
| 0.7076388888888889 | 16.636 |
| 0.7083333333333334 | 16.636 |
| 0.7090277777777777 | 16.636 |
| 0.7097222222222223 | 16.636 |
| 0.7104166666666667 | 12.257 |
| 0.7111111111111111 | 12.257 |
| 0.7118055555555555 | 12.257 |
| 0.7125 | 12.257 |
| 0.7131944444444445 | 12.257 |
| 0.7138888888888889 | 12.257 |
| 0.7145833333333332 | 12.257 |
| 0.7152777777777778 | 12.257 |
| 0.7159722222222222 | 12.257 |
| 0.7166666666666667 | 12.257 |
| 0.717361111111111 | 7.887 |
| 0.7180555555555556 | 7.887 |
| 0.71875 | 7.887 |
| 0.7194444444444444 | 7.887 |
| 0.720138888888889 | 7.887 |
| 0.7208333333333333 | 7.887 |
| 0.7215277777777778 | 7.887 |
| 0.7222222222222222 | 3.525 |
| 0.7229166666666668 | 3.525 |
| 0.7236111111111111 | 3.525 |
| 0.7243055555555555 | 3.525 |
| 0.725 | 3.525 |
| 0.7256944444444445 | 3.525 |
| 0.7263888888888889 | 3.525 |
| 0.7270833333333333 | 3.525 |
| 0.7277777777777777 | 3.525 |
| 0.7284722222222223 | 3.525 |
| 0.7291666666666666 | 3.525 |
| 0.7298611111111111 | 3.525 |
| 0.7305555555555556 | 3.525 |
| 0.7312500000000001 | 0 |
| 0.7319444444444444 | 0 |
| 0.7326388888888888 | 0 |
| 0.7333333333333334 | 0 |
| 0.7340277777777778 | 0 |
| 0.7347222222222222 | 0 |
| 0.7354166666666666 | 0 |
| 0.7361111111111112 | 0 |
| 0.7368055555555556 | 0 |
| 0.7374999999999999 | 0 |
| 0.7381944444444444 | 0 |
| 0.7388888888888889 | 0 |
| 0.7395833333333334 | 0 |
| 0.7402777777777777 | 0 |
| 0.7409722222222223 | 0 |
| 0.7416666666666667 | 0 |
| 0.7423611111111111 | 0 |
| 0.7430555555555555 | 0 |
| 0.74375 | 0 |
| 0.7444444444444445 | 0 |
| 0.7451388888888889 | 0 |
| 0.7458333333333332 | 0 |
| 0.7465277777777778 | 0 |
| 0.7472222222222222 | 0 |
| 0.7479166666666667 | 0 |
| 0.748611111111111 | 0 |
| 0.7493055555555556 | 0 |
| 0.75 | 0 |
| 0.7506944444444444 | 0 |
| 0.751388888888889 | 0 |
| 0.7520833333333333 | 0 |
| 0.7527777777777778 | 0 |
| 0.7534722222222222 | 0 |
| 0.7541666666666668 | 0 |
| 0.7548611111111111 | 0 |
| 0.7555555555555555 | 0 |
| 0.75625 | 0 |
| 0.7569444444444445 | 0 |
| 0.7576388888888889 | 0 |
| 0.7583333333333333 | 0 |
| 0.7590277777777777 | 0 |
| 0.7597222222222223 | 0 |
| 0.7604166666666666 | 0 |
| 0.7611111111111111 | 0 |
| 0.7618055555555556 | 0 |
| 0.7625000000000001 | 0 |
| 0.7631944444444444 | 0 |
| 0.7638888888888888 | 0 |
| 0.7645833333333334 | 0 |
| 0.7652777777777778 | 0 |
| 0.7659722222222222 | 0 |
| 0.7666666666666666 | 0 |
| 0.7673611111111112 | 0 |
| 0.7680555555555556 | 0 |
| 0.7687499999999999 | 0 |
| 0.7694444444444444 | 0 |
| 0.7701388888888889 | 0 |
| 0.7708333333333334 | 0 |
| 0.7715277777777777 | 0 |
| 0.7722222222222223 | 0 |
| 0.7729166666666667 | 0 |
| 0.7736111111111111 | 0 |
| 0.7743055555555555 | 0 |
| 0.775 | 0 |
| 0.7756944444444445 | 0 |
| 0.7763888888888889 | 0 |
| 0.7770833333333332 | 0 |
| 0.7777777777777778 | 0 |
| 0.7784722222222222 | 0 |
| 0.7791666666666667 | 0 |
| 0.779861111111111 | 0 |
| 0.7805555555555556 | 0 |
| 0.78125 | 0 |
| 0.7819444444444444 | 0 |
| 0.782638888888889 | 0 |
| 0.7833333333333333 | 0 |
| 0.7840277777777778 | 0 |
| 0.7847222222222222 | 0 |
| 0.7854166666666668 | 0 |
| 0.7861111111111111 | 0 |
| 0.7868055555555555 | 0 |
| 0.7875 | 0 |
| 0.7881944444444445 | 0 |
| 0.7888888888888889 | 0 |
| 0.7895833333333333 | 0 |
| 0.7902777777777777 | 0 |
| 0.7909722222222223 | 0 |
| 0.7916666666666666 | 0 |
| 0.7923611111111111 | 0 |
| 0.7930555555555556 | 0 |
| 0.7937500000000001 | 0 |
| 0.7944444444444444 | 0 |
| 0.7951388888888888 | 0 |
| 0.7958333333333334 | 0 |
| 0.7965277777777778 | 0 |
| 0.7972222222222222 | 0 |
| 0.7979166666666666 | 0 |
| 0.7986111111111112 | 0 |
| 0.7993055555555556 | 0 |
| 0.7999999999999999 | 0 |
| 0.8006944444444444 | 0 |
| 0.8013888888888889 | 0 |
| 0.8020833333333334 | 0 |
| 0.8027777777777777 | 0 |
| 0.8034722222222223 | 0 |
| 0.8041666666666667 | 0 |
| 0.8048611111111111 | 0 |
| 0.8055555555555555 | 0 |
| 0.80625 | 0 |
| 0.8069444444444445 | 0 |
| 0.8076388888888889 | 0 |
| 0.8083333333333332 | 0 |
| 0.8090277777777778 | 0 |
| 0.8097222222222222 | 0 |
| 0.8104166666666667 | 0 |
| 0.811111111111111 | 0 |
| 0.8118055555555556 | 0 |
| 0.8125 | 0 |
| 0.8131944444444444 | 0 |
| 0.813888888888889 | 0 |
| 0.8145833333333333 | 0 |
| 0.8152777777777778 | 0 |
| 0.8159722222222222 | 0 |
| 0.8166666666666668 | 0 |
| 0.8173611111111111 | 0 |
| 0.8180555555555555 | 0 |
| 0.81875 | 0 |
| 0.8194444444444445 | 0 |
| 0.8201388888888889 | 0 |
| 0.8208333333333333 | 0 |
| 0.8215277777777777 | 0 |
| 0.8222222222222223 | 0 |
| 0.8229166666666666 | 0 |
| 0.8236111111111111 | 0 |
| 0.8243055555555556 | 0 |
| 0.8250000000000001 | 0 |
| 0.8256944444444444 | 0 |
| 0.8263888888888888 | 0 |
| 0.8270833333333334 | 0 |
| 0.8277777777777778 | 0 |
| 0.8284722222222222 | 0 |
| 0.8291666666666666 | 0 |
| 0.8298611111111112 | 0 |
| 0.8305555555555556 | 0 |
| 0.8312499999999999 | 0 |
| 0.8319444444444444 | 0 |
| 0.8326388888888889 | 0 |
| 0.8333333333333334 | 0 |
| 0.8340277777777777 | 0 |
| 0.8347222222222223 | 0 |
| 0.8354166666666667 | 0 |
| 0.8361111111111111 | 0 |
| 0.8368055555555555 | 0 |
| 0.8375 | 0 |
| 0.8381944444444445 | 0 |
| 0.8388888888888889 | 0 |
| 0.8395833333333332 | 0 |
| 0.8402777777777778 | 0 |
| 0.8409722222222222 | 0 |
| 0.8416666666666667 | 0 |
| 0.842361111111111 | 0 |
| 0.8430555555555556 | 0 |
| 0.84375 | 0 |
| 0.8444444444444444 | 0 |
| 0.845138888888889 | 0 |
| 0.8458333333333333 | 0 |
| 0.8465277777777778 | 0 |
| 0.8472222222222222 | 0 |
| 0.8479166666666668 | 0 |
| 0.8486111111111111 | 0 |
| 0.8493055555555555 | 0 |
| 0.85 | 0 |
| 0.8506944444444445 | 0 |
| 0.8513888888888889 | 0 |
| 0.8520833333333333 | 0 |
| 0.8527777777777777 | 0 |
| 0.8534722222222223 | 0 |
| 0.8541666666666666 | 0 |
| 0.8548611111111111 | 0 |
| 0.8555555555555556 | 0 |
| 0.8562500000000001 | 0 |
| 0.8569444444444444 | 0 |
| 0.8576388888888888 | 0 |
| 0.8583333333333334 | 0 |
| 0.8590277777777778 | 0 |
| 0.8597222222222222 | 0 |
| 0.8604166666666666 | 0 |
| 0.8611111111111112 | 0 |
| 0.8618055555555556 | 0 |
| 0.8624999999999999 | 0 |
| 0.8631944444444444 | 0 |
| 0.8638888888888889 | 0 |
| 0.8645833333333334 | 0 |
| 0.8652777777777777 | 0 |
| 0.8659722222222223 | 0 |
| 0.8666666666666667 | 0 |
| 0.8673611111111111 | 0 |
| 0.8680555555555555 | 0 |
| 0.86875 | 0 |
| 0.8694444444444445 | 0 |
| 0.8701388888888889 | 0 |
| 0.8708333333333332 | 0 |
| 0.8715277777777778 | 0 |
| 0.8722222222222222 | 0 |
| 0.8729166666666667 | 0 |
| 0.873611111111111 | 0 |
| 0.8743055555555556 | 0 |
| 0.875 | 0 |
| 0.8756944444444444 | 0 |
| 0.876388888888889 | 0 |
| 0.8770833333333333 | 0 |
| 0.8777777777777778 | 0 |
| 0.8784722222222222 | 0 |
| 0.8791666666666668 | 0 |
| 0.8798611111111111 | 0 |
| 0.8805555555555555 | 0 |
| 0.88125 | 0 |
| 0.8819444444444445 | 0 |
| 0.8826388888888889 | 0 |
| 0.8833333333333333 | 0 |
| 0.8840277777777777 | 0 |
| 0.8847222222222223 | 0 |
| 0.8854166666666666 | 0 |
| 0.8861111111111111 | 0 |
| 0.8868055555555556 | 0 |
| 0.8875000000000001 | 0 |
| 0.8881944444444444 | 0 |
| 0.8888888888888888 | 0 |
| 0.8895833333333334 | 0 |
| 0.8902777777777778 | 0 |
| 0.8909722222222222 | 0 |
| 0.8916666666666666 | 0 |
| 0.8923611111111112 | 0 |
| 0.8930555555555556 | 0 |
| 0.8937499999999999 | 0 |
| 0.8944444444444444 | 0 |
| 0.8951388888888889 | 0 |
| 0.8958333333333334 | 0 |
| 0.8965277777777777 | 0 |
| 0.8972222222222223 | 0 |
| 0.8979166666666667 | 0 |
| 0.8986111111111111 | 0 |
| 0.8993055555555555 | 0 |
| 0.9 | 0 |
| 0.9006944444444445 | 0 |
| 0.9013888888888889 | 0 |
| 0.9020833333333332 | 0 |
| 0.9027777777777778 | 0 |
| 0.9034722222222222 | 0 |
| 0.9041666666666667 | 0 |
| 0.904861111111111 | 0 |
| 0.9055555555555556 | 0 |
| 0.90625 | 0 |
| 0.9069444444444444 | 0 |
| 0.907638888888889 | 0 |
| 0.9083333333333333 | 0 |
| 0.9090277777777778 | 0 |
| 0.9097222222222222 | 0 |
| 0.9104166666666668 | 0 |
| 0.9111111111111111 | 0 |
| 0.9118055555555555 | 0 |
| 0.9125 | 0 |
| 0.9131944444444445 | 0 |
| 0.9138888888888889 | 0 |
| 0.9145833333333333 | 0 |
| 0.9152777777777777 | 0 |
| 0.9159722222222223 | 0 |
| 0.9166666666666666 | 0 |
| 0.9173611111111111 | 0 |
| 0.9180555555555556 | 0 |
| 0.9187500000000001 | 0 |
| 0.9194444444444444 | 0 |
| 0.9201388888888888 | 0 |
| 0.9208333333333334 | 0 |
| 0.9215277777777778 | 0 |
| 0.9222222222222222 | 0 |
| 0.9229166666666666 | 0 |
| 0.9236111111111112 | 0 |
| 0.9243055555555556 | 0 |
| 0.9249999999999999 | 0 |
| 0.9256944444444444 | 0 |
| 0.9263888888888889 | 0 |
| 0.9270833333333334 | 0 |
| 0.9277777777777777 | 0 |
| 0.9284722222222223 | 0 |
| 0.9291666666666667 | 0 |
| 0.9298611111111111 | 0 |
| 0.9305555555555555 | 0 |
| 0.93125 | 0 |
| 0.9319444444444445 | 0 |
| 0.9326388888888889 | 0 |
| 0.9333333333333332 | 0 |
| 0.9340277777777778 | 0 |
| 0.9347222222222222 | 0 |
| 0.9354166666666667 | 0 |
| 0.936111111111111 | 0 |
| 0.9368055555555556 | 0 |
| 0.9375 | 0 |
| 0.9381944444444444 | 0 |
| 0.938888888888889 | 0 |
| 0.9395833333333333 | 0 |
| 0.9402777777777778 | 0 |
| 0.9409722222222222 | 0 |
| 0.9416666666666668 | 0 |
| 0.9423611111111111 | 0 |
| 0.9430555555555555 | 0 |
| 0.94375 | 0 |
| 0.9444444444444445 | 0 |
| 0.9451388888888889 | 0 |
| 0.9458333333333333 | 0 |
| 0.9465277777777777 | 0 |
| 0.9472222222222223 | 0 |
| 0.9479166666666666 | 0 |
| 0.9486111111111111 | 0 |
| 0.9493055555555556 | 0 |
| 0.9500000000000001 | 0 |
| 0.9506944444444444 | 0 |
| 0.9513888888888888 | 0 |
| 0.9520833333333334 | 0 |
| 0.9527777777777778 | 0 |
| 0.9534722222222222 | 0 |
| 0.9541666666666666 | 0 |
| 0.9548611111111112 | 0 |
| 0.9555555555555556 | 0 |
| 0.9562499999999999 | 0 |
| 0.9569444444444444 | 0 |
| 0.9576388888888889 | 0 |
| 0.9583333333333334 | 0 |
| 0.9590277777777777 | 0 |
| 0.9597222222222223 | 0 |
| 0.9604166666666667 | 0 |
| 0.9611111111111111 | 0 |
| 0.9618055555555555 | 0 |
| 0.9625 | 0 |
| 0.9631944444444445 | 0 |
| 0.9638888888888889 | 0 |
| 0.9645833333333332 | 0 |
| 0.9652777777777778 | 0 |
| 0.9659722222222222 | 0 |
| 0.9666666666666667 | 0 |
| 0.967361111111111 | 0 |
| 0.9680555555555556 | 0 |
| 0.96875 | 0 |
| 0.9694444444444444 | 0 |
| 0.970138888888889 | 0 |
| 0.9708333333333333 | 0 |
| 0.9715277777777778 | 0 |
| 0.9722222222222222 | 0 |
| 0.9729166666666668 | 0 |
| 0.9736111111111111 | 0 |
| 0.9743055555555555 | 0 |
| 0.975 | 0 |
| 0.9756944444444445 | 0 |
| 0.9763888888888889 | 0 |
| 0.9770833333333333 | 0 |
| 0.9777777777777777 | 0 |
| 0.9784722222222223 | 0 |
| 0.9791666666666666 | 0 |
| 0.9798611111111111 | 0 |
| 0.9805555555555556 | 0 |
| 0.9812500000000001 | 0 |
| 0.9819444444444444 | 0 |
| 0.9826388888888888 | 0 |
| 0.9833333333333334 | 0 |
| 0.9840277777777778 | 0 |
| 0.9847222222222222 | 0 |
| 0.9854166666666666 | 0 |
| 0.9861111111111112 | 0 |
| 0.9868055555555556 | 0 |
| 0.9874999999999999 | 0 |
| 0.9881944444444444 | 0 |
| 0.9888888888888889 | 0 |
| 0.9895833333333334 | 0 |
| 0.9902777777777777 | 0 |
| 0.9909722222222223 | 0 |
| 0.9916666666666667 | 0 |
| 0.9923611111111111 | 0 |
| 0.9930555555555555 | 0 |
| 0.99375 | 0 |
| 0.9944444444444445 | 0 |
| 0.9951388888888889 | 0 |
| 0.9958333333333332 | 0 |
| 0.9965277777777778 | 0 |
| 0.9972222222222222 | 0 |
| 0.9979166666666667 | 0 |
| 0.998611111111111 | 0 |
| 0.9993055555555556 | 0 |